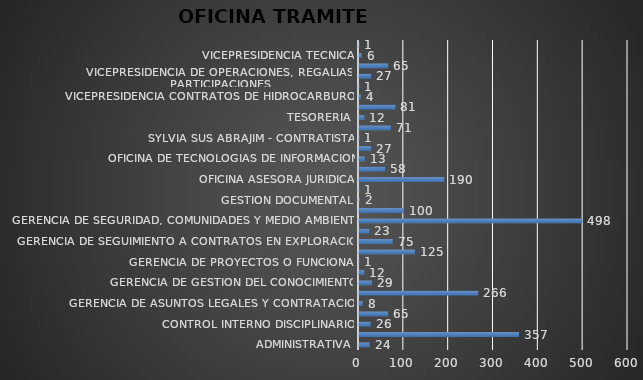
| Category | OFICINA DE TRAMITE FINAL DE  2020 |
|---|---|
| ADMINISTRATIVA | 24 |
| ATENCION CIUDADANA Y COMUNICACIONES | 357 |
| CONTROL INTERNO DISCIPLINARIO | 26 |
| FINANCIERA | 65 |
| GERENCIA DE ASUNTOS LEGALES Y CONTRATACION | 8 |
| GERENCIA DE GESTION DE LA INFORMACION TECNICA | 266 |
| GERENCIA DE GESTION DEL CONOCIMIENTO | 29 |
| GERENCIA DE PLANEACION | 12 |
| GERENCIA DE PROYECTOS O FUNCIONAL | 1 |
| GERENCIA DE RESERVAS Y OPERACIONES | 125 |
| GERENCIA DE SEGUIMIENTO A CONTRATOS EN EXPLORACION | 75 |
| GERENCIA DE SEGUIMIENTO A CONTRATOS EN PRODUCCION | 23 |
| GERENCIA DE SEGURIDAD, COMUNIDADES Y MEDIO AMBIENTE | 498 |
| GESTION DE REGALIAS Y DERECHOS ECONOMICOS | 100 |
| GESTION DOCUMENTAL | 2 |
| OFICINA  ASESORA JURIDICA | 1 |
| OFICINA ASESORA JURIDICA | 190 |
| OFICINA DE CONTROL INTERNO | 58 |
| OFICINA DE TECNOLOGIAS DE INFORMACION | 13 |
| PRESIDENCIA | 27 |
| SYLVIA SUS ABRAJIM - CONTRATISTA- | 1 |
| TALENTO HUMANO | 71 |
| TESORERIA | 12 |
| VICEPRESIDENCIA ADMINISTRATIVA Y FINANCIERA | 81 |
| VICEPRESIDENCIA CONTRATOS DE HIDROCARBUROS | 4 |
| VICEPRESIDENCIA DE CONTRATOS DE HIDROCARBUROS | 1 |
| VICEPRESIDENCIA DE OPERACIONES, REGALIAS Y PARTICIPACIONES | 27 |
| VICEPRESIDENCIA PROMOCION Y ASIGNACION DE AREAS | 65 |
| VICEPRESIDENCIA TECNICA | 6 |
| GERENCIA DE SEGURIDAD, COMUNIDADES Y MEDIO AMBIENTE  | 1 |